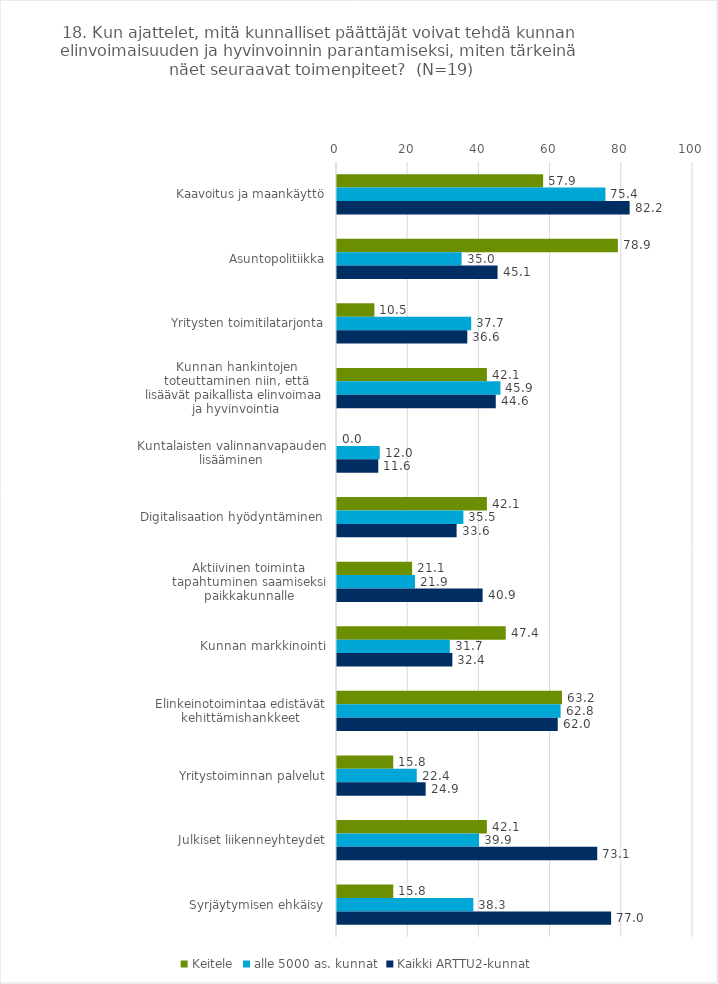
| Category | Keitele | alle 5000 as. kunnat | Kaikki ARTTU2-kunnat |
|---|---|---|---|
| Kaavoitus ja maankäyttö | 57.9 | 75.4 | 82.2 |
| Asuntopolitiikka | 78.9 | 35 | 45.1 |
| Yritysten toimitilatarjonta | 10.5 | 37.7 | 36.6 |
| Kunnan hankintojen toteuttaminen niin, että lisäävät paikallista elinvoimaa ja hyvinvointia | 42.1 | 45.9 | 44.6 |
| Kuntalaisten valinnanvapauden lisääminen | 0 | 12 | 11.6 |
| Digitalisaation hyödyntäminen | 42.1 | 35.5 | 33.6 |
| Aktiivinen toiminta tapahtuminen saamiseksi paikkakunnalle | 21.1 | 21.9 | 40.9 |
| Kunnan markkinointi | 47.4 | 31.7 | 32.4 |
| Elinkeinotoimintaa edistävät kehittämishankkeet | 63.2 | 62.8 | 62 |
| Yritystoiminnan palvelut | 15.8 | 22.4 | 24.9 |
| Julkiset liikenneyhteydet | 42.1 | 39.9 | 73.1 |
| Syrjäytymisen ehkäisy | 15.8 | 38.3 | 77 |